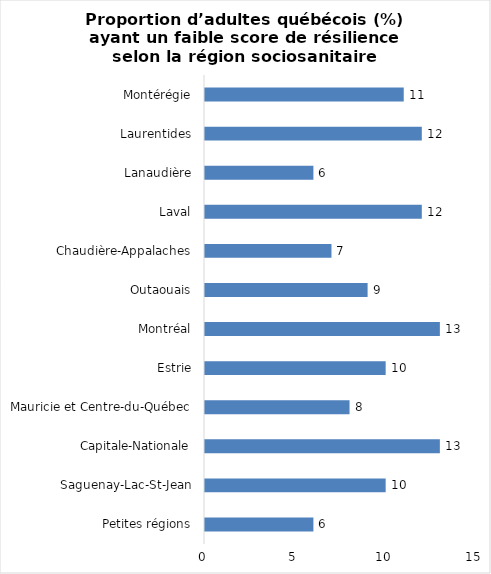
| Category | Series 0 |
|---|---|
| Petites régions | 6 |
| Saguenay-Lac-St-Jean | 10 |
| Capitale-Nationale | 13 |
| Mauricie et Centre-du-Québec | 8 |
| Estrie | 10 |
| Montréal | 13 |
| Outaouais | 9 |
| Chaudière-Appalaches | 7 |
| Laval | 12 |
| Lanaudière | 6 |
| Laurentides | 12 |
| Montérégie | 11 |